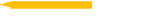
| Category | Lack of in-house technical expertise |
|---|---|
| Lack of in-house technical expertise | 3 |